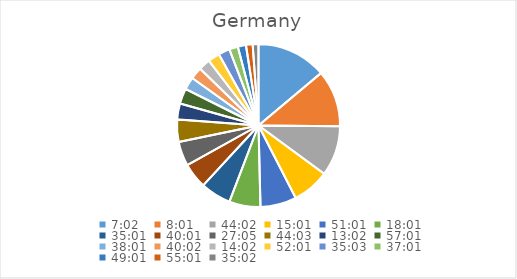
| Category | Series 0 |
|---|---|
| 0.29305555555555557 | 13.187 |
| 0.3340277777777778 | 10.687 |
| 1.8347222222222221 | 9.445 |
| 0.6256944444444444 | 6.982 |
| 2.1256944444444446 | 6.797 |
| 0.7506944444444444 | 5.882 |
| 1.4590277777777778 | 5.762 |
| 1.667361111111111 | 4.805 |
| 1.128472222222222 | 4.569 |
| 1.8354166666666665 | 4.216 |
| 0.5430555555555555 | 3 |
| 2.3756944444444446 | 2.886 |
| 1.5840277777777778 | 2.374 |
| 1.6680555555555554 | 2.261 |
| 0.5847222222222223 | 2.205 |
| 2.167361111111111 | 2.205 |
| 1.4604166666666665 | 2.149 |
| 1.542361111111111 | 1.645 |
| 2.042361111111111 | 1.533 |
| 2.292361111111111 | 1.256 |
| 1.4597222222222221 | 1.091 |